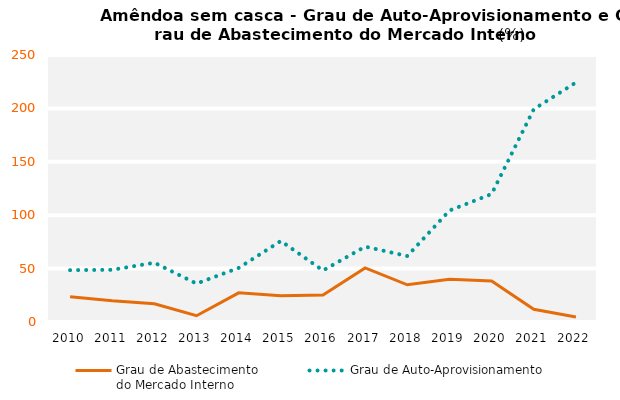
| Category | Grau de Abastecimento
do Mercado Interno | Grau de Auto-Aprovisionamento |
|---|---|---|
| 2010.0 | 23.646 | 48.551 |
| 2011.0 | 19.809 | 48.861 |
| 2012.0 | 17.137 | 55.509 |
| 2013.0 | 5.884 | 35.948 |
| 2014.0 | 27.278 | 50.641 |
| 2015.0 | 24.559 | 75.864 |
| 2016.0 | 25.213 | 48.218 |
| 2017.0 | 50.631 | 70.549 |
| 2018.0 | 34.814 | 61.758 |
| 2019.0 | 39.974 | 104.351 |
| 2020.0 | 38.461 | 119.834 |
| 2021.0 | 11.946 | 199.245 |
| 2022.0 | 4.71 | 224.259 |